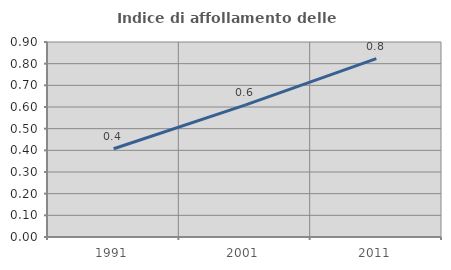
| Category | Indice di affollamento delle abitazioni  |
|---|---|
| 1991.0 | 0.407 |
| 2001.0 | 0.609 |
| 2011.0 | 0.823 |